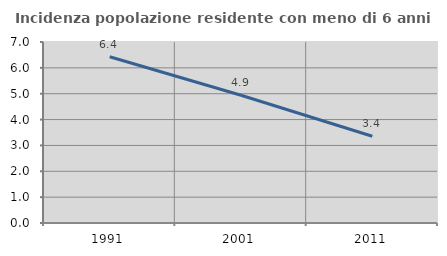
| Category | Incidenza popolazione residente con meno di 6 anni |
|---|---|
| 1991.0 | 6.427 |
| 2001.0 | 4.942 |
| 2011.0 | 3.355 |